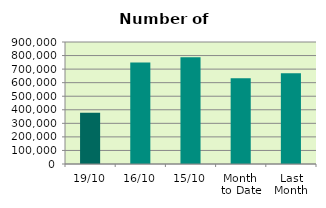
| Category | Series 0 |
|---|---|
| 19/10 | 377196 |
| 16/10 | 749584 |
| 15/10 | 786798 |
| Month 
to Date | 633397.231 |
| Last
Month | 670189.636 |